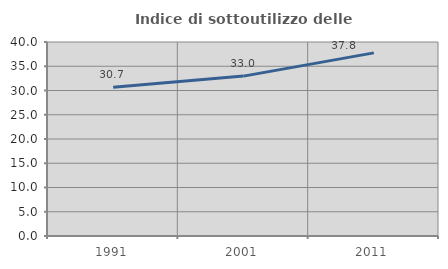
| Category | Indice di sottoutilizzo delle abitazioni  |
|---|---|
| 1991.0 | 30.68 |
| 2001.0 | 32.966 |
| 2011.0 | 37.754 |